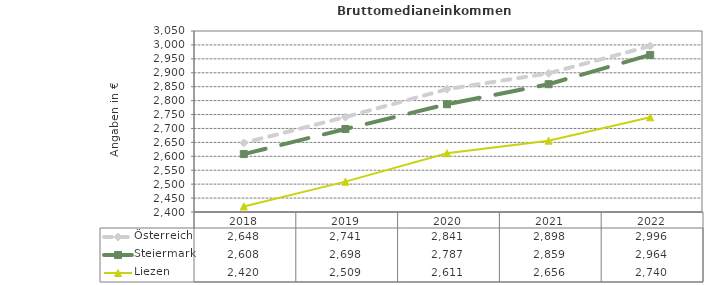
| Category | Österreich | Steiermark | Liezen |
|---|---|---|---|
| 2022.0 | 2996 | 2964 | 2740 |
| 2021.0 | 2898 | 2859 | 2656 |
| 2020.0 | 2841 | 2787 | 2611 |
| 2019.0 | 2741 | 2698 | 2509 |
| 2018.0 | 2648 | 2608 | 2420 |